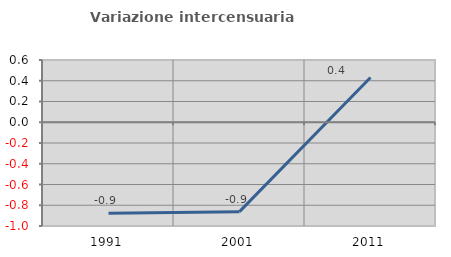
| Category | Variazione intercensuaria annua |
|---|---|
| 1991.0 | -0.877 |
| 2001.0 | -0.861 |
| 2011.0 | 0.432 |